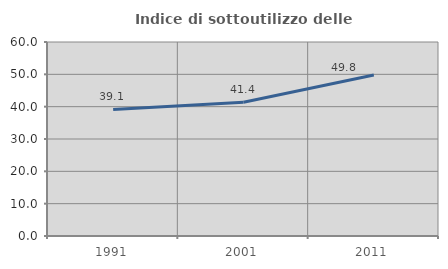
| Category | Indice di sottoutilizzo delle abitazioni  |
|---|---|
| 1991.0 | 39.13 |
| 2001.0 | 41.366 |
| 2011.0 | 49.819 |